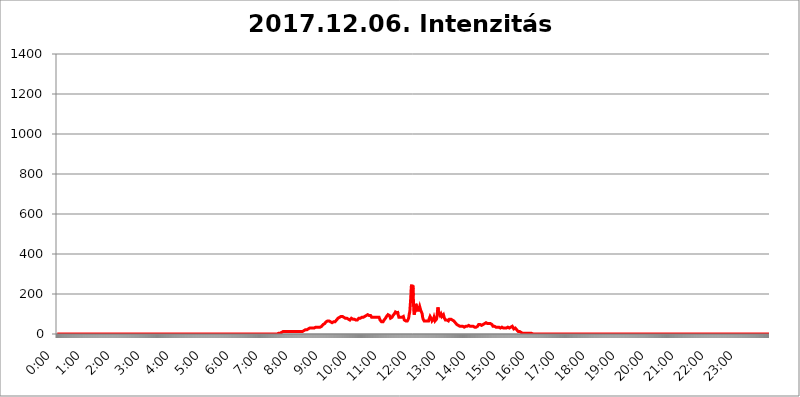
| Category | 2017.12.06. Intenzitás [W/m^2] |
|---|---|
| 0.0 | 0 |
| 0.0006944444444444445 | 0 |
| 0.001388888888888889 | 0 |
| 0.0020833333333333333 | 0 |
| 0.002777777777777778 | 0 |
| 0.003472222222222222 | 0 |
| 0.004166666666666667 | 0 |
| 0.004861111111111111 | 0 |
| 0.005555555555555556 | 0 |
| 0.0062499999999999995 | 0 |
| 0.006944444444444444 | 0 |
| 0.007638888888888889 | 0 |
| 0.008333333333333333 | 0 |
| 0.009027777777777779 | 0 |
| 0.009722222222222222 | 0 |
| 0.010416666666666666 | 0 |
| 0.011111111111111112 | 0 |
| 0.011805555555555555 | 0 |
| 0.012499999999999999 | 0 |
| 0.013194444444444444 | 0 |
| 0.013888888888888888 | 0 |
| 0.014583333333333332 | 0 |
| 0.015277777777777777 | 0 |
| 0.015972222222222224 | 0 |
| 0.016666666666666666 | 0 |
| 0.017361111111111112 | 0 |
| 0.018055555555555557 | 0 |
| 0.01875 | 0 |
| 0.019444444444444445 | 0 |
| 0.02013888888888889 | 0 |
| 0.020833333333333332 | 0 |
| 0.02152777777777778 | 0 |
| 0.022222222222222223 | 0 |
| 0.02291666666666667 | 0 |
| 0.02361111111111111 | 0 |
| 0.024305555555555556 | 0 |
| 0.024999999999999998 | 0 |
| 0.025694444444444447 | 0 |
| 0.02638888888888889 | 0 |
| 0.027083333333333334 | 0 |
| 0.027777777777777776 | 0 |
| 0.02847222222222222 | 0 |
| 0.029166666666666664 | 0 |
| 0.029861111111111113 | 0 |
| 0.030555555555555555 | 0 |
| 0.03125 | 0 |
| 0.03194444444444445 | 0 |
| 0.03263888888888889 | 0 |
| 0.03333333333333333 | 0 |
| 0.034027777777777775 | 0 |
| 0.034722222222222224 | 0 |
| 0.035416666666666666 | 0 |
| 0.036111111111111115 | 0 |
| 0.03680555555555556 | 0 |
| 0.0375 | 0 |
| 0.03819444444444444 | 0 |
| 0.03888888888888889 | 0 |
| 0.03958333333333333 | 0 |
| 0.04027777777777778 | 0 |
| 0.04097222222222222 | 0 |
| 0.041666666666666664 | 0 |
| 0.042361111111111106 | 0 |
| 0.04305555555555556 | 0 |
| 0.043750000000000004 | 0 |
| 0.044444444444444446 | 0 |
| 0.04513888888888889 | 0 |
| 0.04583333333333334 | 0 |
| 0.04652777777777778 | 0 |
| 0.04722222222222222 | 0 |
| 0.04791666666666666 | 0 |
| 0.04861111111111111 | 0 |
| 0.049305555555555554 | 0 |
| 0.049999999999999996 | 0 |
| 0.05069444444444445 | 0 |
| 0.051388888888888894 | 0 |
| 0.052083333333333336 | 0 |
| 0.05277777777777778 | 0 |
| 0.05347222222222222 | 0 |
| 0.05416666666666667 | 0 |
| 0.05486111111111111 | 0 |
| 0.05555555555555555 | 0 |
| 0.05625 | 0 |
| 0.05694444444444444 | 0 |
| 0.057638888888888885 | 0 |
| 0.05833333333333333 | 0 |
| 0.05902777777777778 | 0 |
| 0.059722222222222225 | 0 |
| 0.06041666666666667 | 0 |
| 0.061111111111111116 | 0 |
| 0.06180555555555556 | 0 |
| 0.0625 | 0 |
| 0.06319444444444444 | 0 |
| 0.06388888888888888 | 0 |
| 0.06458333333333334 | 0 |
| 0.06527777777777778 | 0 |
| 0.06597222222222222 | 0 |
| 0.06666666666666667 | 0 |
| 0.06736111111111111 | 0 |
| 0.06805555555555555 | 0 |
| 0.06874999999999999 | 0 |
| 0.06944444444444443 | 0 |
| 0.07013888888888889 | 0 |
| 0.07083333333333333 | 0 |
| 0.07152777777777779 | 0 |
| 0.07222222222222223 | 0 |
| 0.07291666666666667 | 0 |
| 0.07361111111111111 | 0 |
| 0.07430555555555556 | 0 |
| 0.075 | 0 |
| 0.07569444444444444 | 0 |
| 0.0763888888888889 | 0 |
| 0.07708333333333334 | 0 |
| 0.07777777777777778 | 0 |
| 0.07847222222222222 | 0 |
| 0.07916666666666666 | 0 |
| 0.0798611111111111 | 0 |
| 0.08055555555555556 | 0 |
| 0.08125 | 0 |
| 0.08194444444444444 | 0 |
| 0.08263888888888889 | 0 |
| 0.08333333333333333 | 0 |
| 0.08402777777777777 | 0 |
| 0.08472222222222221 | 0 |
| 0.08541666666666665 | 0 |
| 0.08611111111111112 | 0 |
| 0.08680555555555557 | 0 |
| 0.08750000000000001 | 0 |
| 0.08819444444444445 | 0 |
| 0.08888888888888889 | 0 |
| 0.08958333333333333 | 0 |
| 0.09027777777777778 | 0 |
| 0.09097222222222222 | 0 |
| 0.09166666666666667 | 0 |
| 0.09236111111111112 | 0 |
| 0.09305555555555556 | 0 |
| 0.09375 | 0 |
| 0.09444444444444444 | 0 |
| 0.09513888888888888 | 0 |
| 0.09583333333333333 | 0 |
| 0.09652777777777777 | 0 |
| 0.09722222222222222 | 0 |
| 0.09791666666666667 | 0 |
| 0.09861111111111111 | 0 |
| 0.09930555555555555 | 0 |
| 0.09999999999999999 | 0 |
| 0.10069444444444443 | 0 |
| 0.1013888888888889 | 0 |
| 0.10208333333333335 | 0 |
| 0.10277777777777779 | 0 |
| 0.10347222222222223 | 0 |
| 0.10416666666666667 | 0 |
| 0.10486111111111111 | 0 |
| 0.10555555555555556 | 0 |
| 0.10625 | 0 |
| 0.10694444444444444 | 0 |
| 0.1076388888888889 | 0 |
| 0.10833333333333334 | 0 |
| 0.10902777777777778 | 0 |
| 0.10972222222222222 | 0 |
| 0.1111111111111111 | 0 |
| 0.11180555555555556 | 0 |
| 0.11180555555555556 | 0 |
| 0.1125 | 0 |
| 0.11319444444444444 | 0 |
| 0.11388888888888889 | 0 |
| 0.11458333333333333 | 0 |
| 0.11527777777777777 | 0 |
| 0.11597222222222221 | 0 |
| 0.11666666666666665 | 0 |
| 0.1173611111111111 | 0 |
| 0.11805555555555557 | 0 |
| 0.11944444444444445 | 0 |
| 0.12013888888888889 | 0 |
| 0.12083333333333333 | 0 |
| 0.12152777777777778 | 0 |
| 0.12222222222222223 | 0 |
| 0.12291666666666667 | 0 |
| 0.12291666666666667 | 0 |
| 0.12361111111111112 | 0 |
| 0.12430555555555556 | 0 |
| 0.125 | 0 |
| 0.12569444444444444 | 0 |
| 0.12638888888888888 | 0 |
| 0.12708333333333333 | 0 |
| 0.16875 | 0 |
| 0.12847222222222224 | 0 |
| 0.12916666666666668 | 0 |
| 0.12986111111111112 | 0 |
| 0.13055555555555556 | 0 |
| 0.13125 | 0 |
| 0.13194444444444445 | 0 |
| 0.1326388888888889 | 0 |
| 0.13333333333333333 | 0 |
| 0.13402777777777777 | 0 |
| 0.13402777777777777 | 0 |
| 0.13472222222222222 | 0 |
| 0.13541666666666666 | 0 |
| 0.1361111111111111 | 0 |
| 0.13749999999999998 | 0 |
| 0.13819444444444443 | 0 |
| 0.1388888888888889 | 0 |
| 0.13958333333333334 | 0 |
| 0.14027777777777778 | 0 |
| 0.14097222222222222 | 0 |
| 0.14166666666666666 | 0 |
| 0.1423611111111111 | 0 |
| 0.14305555555555557 | 0 |
| 0.14375000000000002 | 0 |
| 0.14444444444444446 | 0 |
| 0.1451388888888889 | 0 |
| 0.1451388888888889 | 0 |
| 0.14652777777777778 | 0 |
| 0.14722222222222223 | 0 |
| 0.14791666666666667 | 0 |
| 0.1486111111111111 | 0 |
| 0.14930555555555555 | 0 |
| 0.15 | 0 |
| 0.15069444444444444 | 0 |
| 0.15138888888888888 | 0 |
| 0.15208333333333332 | 0 |
| 0.15277777777777776 | 0 |
| 0.15347222222222223 | 0 |
| 0.15416666666666667 | 0 |
| 0.15486111111111112 | 0 |
| 0.15555555555555556 | 0 |
| 0.15625 | 0 |
| 0.15694444444444444 | 0 |
| 0.15763888888888888 | 0 |
| 0.15833333333333333 | 0 |
| 0.15902777777777777 | 0 |
| 0.15972222222222224 | 0 |
| 0.16041666666666668 | 0 |
| 0.16111111111111112 | 0 |
| 0.16180555555555556 | 0 |
| 0.1625 | 0 |
| 0.16319444444444445 | 0 |
| 0.1638888888888889 | 0 |
| 0.16458333333333333 | 0 |
| 0.16527777777777777 | 0 |
| 0.16597222222222222 | 0 |
| 0.16666666666666666 | 0 |
| 0.1673611111111111 | 0 |
| 0.16805555555555554 | 0 |
| 0.16874999999999998 | 0 |
| 0.16944444444444443 | 0 |
| 0.17013888888888887 | 0 |
| 0.1708333333333333 | 0 |
| 0.17152777777777775 | 0 |
| 0.17222222222222225 | 0 |
| 0.1729166666666667 | 0 |
| 0.17361111111111113 | 0 |
| 0.17430555555555557 | 0 |
| 0.17500000000000002 | 0 |
| 0.17569444444444446 | 0 |
| 0.1763888888888889 | 0 |
| 0.17708333333333334 | 0 |
| 0.17777777777777778 | 0 |
| 0.17847222222222223 | 0 |
| 0.17916666666666667 | 0 |
| 0.1798611111111111 | 0 |
| 0.18055555555555555 | 0 |
| 0.18125 | 0 |
| 0.18194444444444444 | 0 |
| 0.1826388888888889 | 0 |
| 0.18333333333333335 | 0 |
| 0.1840277777777778 | 0 |
| 0.18472222222222223 | 0 |
| 0.18541666666666667 | 0 |
| 0.18611111111111112 | 0 |
| 0.18680555555555556 | 0 |
| 0.1875 | 0 |
| 0.18819444444444444 | 0 |
| 0.18888888888888888 | 0 |
| 0.18958333333333333 | 0 |
| 0.19027777777777777 | 0 |
| 0.1909722222222222 | 0 |
| 0.19166666666666665 | 0 |
| 0.19236111111111112 | 0 |
| 0.19305555555555554 | 0 |
| 0.19375 | 0 |
| 0.19444444444444445 | 0 |
| 0.1951388888888889 | 0 |
| 0.19583333333333333 | 0 |
| 0.19652777777777777 | 0 |
| 0.19722222222222222 | 0 |
| 0.19791666666666666 | 0 |
| 0.1986111111111111 | 0 |
| 0.19930555555555554 | 0 |
| 0.19999999999999998 | 0 |
| 0.20069444444444443 | 0 |
| 0.20138888888888887 | 0 |
| 0.2020833333333333 | 0 |
| 0.2027777777777778 | 0 |
| 0.2034722222222222 | 0 |
| 0.2041666666666667 | 0 |
| 0.20486111111111113 | 0 |
| 0.20555555555555557 | 0 |
| 0.20625000000000002 | 0 |
| 0.20694444444444446 | 0 |
| 0.2076388888888889 | 0 |
| 0.20833333333333334 | 0 |
| 0.20902777777777778 | 0 |
| 0.20972222222222223 | 0 |
| 0.21041666666666667 | 0 |
| 0.2111111111111111 | 0 |
| 0.21180555555555555 | 0 |
| 0.2125 | 0 |
| 0.21319444444444444 | 0 |
| 0.2138888888888889 | 0 |
| 0.21458333333333335 | 0 |
| 0.2152777777777778 | 0 |
| 0.21597222222222223 | 0 |
| 0.21666666666666667 | 0 |
| 0.21736111111111112 | 0 |
| 0.21805555555555556 | 0 |
| 0.21875 | 0 |
| 0.21944444444444444 | 0 |
| 0.22013888888888888 | 0 |
| 0.22083333333333333 | 0 |
| 0.22152777777777777 | 0 |
| 0.2222222222222222 | 0 |
| 0.22291666666666665 | 0 |
| 0.2236111111111111 | 0 |
| 0.22430555555555556 | 0 |
| 0.225 | 0 |
| 0.22569444444444445 | 0 |
| 0.2263888888888889 | 0 |
| 0.22708333333333333 | 0 |
| 0.22777777777777777 | 0 |
| 0.22847222222222222 | 0 |
| 0.22916666666666666 | 0 |
| 0.2298611111111111 | 0 |
| 0.23055555555555554 | 0 |
| 0.23124999999999998 | 0 |
| 0.23194444444444443 | 0 |
| 0.23263888888888887 | 0 |
| 0.2333333333333333 | 0 |
| 0.2340277777777778 | 0 |
| 0.2347222222222222 | 0 |
| 0.2354166666666667 | 0 |
| 0.23611111111111113 | 0 |
| 0.23680555555555557 | 0 |
| 0.23750000000000002 | 0 |
| 0.23819444444444446 | 0 |
| 0.2388888888888889 | 0 |
| 0.23958333333333334 | 0 |
| 0.24027777777777778 | 0 |
| 0.24097222222222223 | 0 |
| 0.24166666666666667 | 0 |
| 0.2423611111111111 | 0 |
| 0.24305555555555555 | 0 |
| 0.24375 | 0 |
| 0.24444444444444446 | 0 |
| 0.24513888888888888 | 0 |
| 0.24583333333333335 | 0 |
| 0.2465277777777778 | 0 |
| 0.24722222222222223 | 0 |
| 0.24791666666666667 | 0 |
| 0.24861111111111112 | 0 |
| 0.24930555555555556 | 0 |
| 0.25 | 0 |
| 0.25069444444444444 | 0 |
| 0.2513888888888889 | 0 |
| 0.2520833333333333 | 0 |
| 0.25277777777777777 | 0 |
| 0.2534722222222222 | 0 |
| 0.25416666666666665 | 0 |
| 0.2548611111111111 | 0 |
| 0.2555555555555556 | 0 |
| 0.25625000000000003 | 0 |
| 0.2569444444444445 | 0 |
| 0.2576388888888889 | 0 |
| 0.25833333333333336 | 0 |
| 0.2590277777777778 | 0 |
| 0.25972222222222224 | 0 |
| 0.2604166666666667 | 0 |
| 0.2611111111111111 | 0 |
| 0.26180555555555557 | 0 |
| 0.2625 | 0 |
| 0.26319444444444445 | 0 |
| 0.2638888888888889 | 0 |
| 0.26458333333333334 | 0 |
| 0.2652777777777778 | 0 |
| 0.2659722222222222 | 0 |
| 0.26666666666666666 | 0 |
| 0.2673611111111111 | 0 |
| 0.26805555555555555 | 0 |
| 0.26875 | 0 |
| 0.26944444444444443 | 0 |
| 0.2701388888888889 | 0 |
| 0.2708333333333333 | 0 |
| 0.27152777777777776 | 0 |
| 0.2722222222222222 | 0 |
| 0.27291666666666664 | 0 |
| 0.2736111111111111 | 0 |
| 0.2743055555555555 | 0 |
| 0.27499999999999997 | 0 |
| 0.27569444444444446 | 0 |
| 0.27638888888888885 | 0 |
| 0.27708333333333335 | 0 |
| 0.2777777777777778 | 0 |
| 0.27847222222222223 | 0 |
| 0.2791666666666667 | 0 |
| 0.2798611111111111 | 0 |
| 0.28055555555555556 | 0 |
| 0.28125 | 0 |
| 0.28194444444444444 | 0 |
| 0.2826388888888889 | 0 |
| 0.2833333333333333 | 0 |
| 0.28402777777777777 | 0 |
| 0.2847222222222222 | 0 |
| 0.28541666666666665 | 0 |
| 0.28611111111111115 | 0 |
| 0.28680555555555554 | 0 |
| 0.28750000000000003 | 0 |
| 0.2881944444444445 | 0 |
| 0.2888888888888889 | 0 |
| 0.28958333333333336 | 0 |
| 0.2902777777777778 | 0 |
| 0.29097222222222224 | 0 |
| 0.2916666666666667 | 0 |
| 0.2923611111111111 | 0 |
| 0.29305555555555557 | 0 |
| 0.29375 | 0 |
| 0.29444444444444445 | 0 |
| 0.2951388888888889 | 0 |
| 0.29583333333333334 | 0 |
| 0.2965277777777778 | 0 |
| 0.2972222222222222 | 0 |
| 0.29791666666666666 | 0 |
| 0.2986111111111111 | 0 |
| 0.29930555555555555 | 0 |
| 0.3 | 0 |
| 0.30069444444444443 | 0 |
| 0.3013888888888889 | 0 |
| 0.3020833333333333 | 0 |
| 0.30277777777777776 | 0 |
| 0.3034722222222222 | 0 |
| 0.30416666666666664 | 0 |
| 0.3048611111111111 | 0 |
| 0.3055555555555555 | 0 |
| 0.30624999999999997 | 0 |
| 0.3069444444444444 | 0 |
| 0.3076388888888889 | 0 |
| 0.30833333333333335 | 0 |
| 0.3090277777777778 | 3.525 |
| 0.30972222222222223 | 3.525 |
| 0.3104166666666667 | 3.525 |
| 0.3111111111111111 | 3.525 |
| 0.31180555555555556 | 3.525 |
| 0.3125 | 3.525 |
| 0.31319444444444444 | 3.525 |
| 0.3138888888888889 | 7.887 |
| 0.3145833333333333 | 7.887 |
| 0.31527777777777777 | 12.257 |
| 0.3159722222222222 | 12.257 |
| 0.31666666666666665 | 12.257 |
| 0.31736111111111115 | 12.257 |
| 0.31805555555555554 | 16.636 |
| 0.31875000000000003 | 12.257 |
| 0.3194444444444445 | 16.636 |
| 0.3201388888888889 | 12.257 |
| 0.32083333333333336 | 12.257 |
| 0.3215277777777778 | 12.257 |
| 0.32222222222222224 | 12.257 |
| 0.3229166666666667 | 12.257 |
| 0.3236111111111111 | 12.257 |
| 0.32430555555555557 | 12.257 |
| 0.325 | 12.257 |
| 0.32569444444444445 | 12.257 |
| 0.3263888888888889 | 12.257 |
| 0.32708333333333334 | 12.257 |
| 0.3277777777777778 | 12.257 |
| 0.3284722222222222 | 12.257 |
| 0.32916666666666666 | 12.257 |
| 0.3298611111111111 | 12.257 |
| 0.33055555555555555 | 12.257 |
| 0.33125 | 12.257 |
| 0.33194444444444443 | 12.257 |
| 0.3326388888888889 | 12.257 |
| 0.3333333333333333 | 12.257 |
| 0.3340277777777778 | 12.257 |
| 0.3347222222222222 | 12.257 |
| 0.3354166666666667 | 12.257 |
| 0.3361111111111111 | 12.257 |
| 0.3368055555555556 | 12.257 |
| 0.33749999999999997 | 12.257 |
| 0.33819444444444446 | 12.257 |
| 0.33888888888888885 | 12.257 |
| 0.33958333333333335 | 12.257 |
| 0.34027777777777773 | 12.257 |
| 0.34097222222222223 | 12.257 |
| 0.3416666666666666 | 12.257 |
| 0.3423611111111111 | 12.257 |
| 0.3430555555555555 | 12.257 |
| 0.34375 | 12.257 |
| 0.3444444444444445 | 16.636 |
| 0.3451388888888889 | 16.636 |
| 0.3458333333333334 | 16.636 |
| 0.34652777777777777 | 16.636 |
| 0.34722222222222227 | 21.024 |
| 0.34791666666666665 | 21.024 |
| 0.34861111111111115 | 21.024 |
| 0.34930555555555554 | 21.024 |
| 0.35000000000000003 | 21.024 |
| 0.3506944444444444 | 21.024 |
| 0.3513888888888889 | 21.024 |
| 0.3520833333333333 | 25.419 |
| 0.3527777777777778 | 25.419 |
| 0.3534722222222222 | 29.823 |
| 0.3541666666666667 | 29.823 |
| 0.3548611111111111 | 25.419 |
| 0.35555555555555557 | 25.419 |
| 0.35625 | 29.823 |
| 0.35694444444444445 | 29.823 |
| 0.3576388888888889 | 29.823 |
| 0.35833333333333334 | 29.823 |
| 0.3590277777777778 | 29.823 |
| 0.3597222222222222 | 29.823 |
| 0.36041666666666666 | 29.823 |
| 0.3611111111111111 | 29.823 |
| 0.36180555555555555 | 29.823 |
| 0.3625 | 34.234 |
| 0.36319444444444443 | 34.234 |
| 0.3638888888888889 | 34.234 |
| 0.3645833333333333 | 34.234 |
| 0.3652777777777778 | 34.234 |
| 0.3659722222222222 | 34.234 |
| 0.3666666666666667 | 34.234 |
| 0.3673611111111111 | 34.234 |
| 0.3680555555555556 | 34.234 |
| 0.36874999999999997 | 34.234 |
| 0.36944444444444446 | 34.234 |
| 0.37013888888888885 | 34.234 |
| 0.37083333333333335 | 38.653 |
| 0.37152777777777773 | 43.079 |
| 0.37222222222222223 | 43.079 |
| 0.3729166666666666 | 47.511 |
| 0.3736111111111111 | 51.951 |
| 0.3743055555555555 | 51.951 |
| 0.375 | 51.951 |
| 0.3756944444444445 | 56.398 |
| 0.3763888888888889 | 56.398 |
| 0.3770833333333334 | 60.85 |
| 0.37777777777777777 | 65.31 |
| 0.37847222222222227 | 65.31 |
| 0.37916666666666665 | 65.31 |
| 0.37986111111111115 | 65.31 |
| 0.38055555555555554 | 65.31 |
| 0.38125000000000003 | 65.31 |
| 0.3819444444444444 | 60.85 |
| 0.3826388888888889 | 60.85 |
| 0.3833333333333333 | 60.85 |
| 0.3840277777777778 | 56.398 |
| 0.3847222222222222 | 56.398 |
| 0.3854166666666667 | 56.398 |
| 0.3861111111111111 | 56.398 |
| 0.38680555555555557 | 56.398 |
| 0.3875 | 60.85 |
| 0.38819444444444445 | 60.85 |
| 0.3888888888888889 | 60.85 |
| 0.38958333333333334 | 60.85 |
| 0.3902777777777778 | 65.31 |
| 0.3909722222222222 | 65.31 |
| 0.39166666666666666 | 69.775 |
| 0.3923611111111111 | 69.775 |
| 0.39305555555555555 | 74.246 |
| 0.39375 | 78.722 |
| 0.39444444444444443 | 78.722 |
| 0.3951388888888889 | 83.205 |
| 0.3958333333333333 | 83.205 |
| 0.3965277777777778 | 83.205 |
| 0.3972222222222222 | 83.205 |
| 0.3979166666666667 | 87.692 |
| 0.3986111111111111 | 87.692 |
| 0.3993055555555556 | 87.692 |
| 0.39999999999999997 | 87.692 |
| 0.40069444444444446 | 83.205 |
| 0.40138888888888885 | 83.205 |
| 0.40208333333333335 | 83.205 |
| 0.40277777777777773 | 83.205 |
| 0.40347222222222223 | 78.722 |
| 0.4041666666666666 | 78.722 |
| 0.4048611111111111 | 78.722 |
| 0.4055555555555555 | 78.722 |
| 0.40625 | 78.722 |
| 0.4069444444444445 | 74.246 |
| 0.4076388888888889 | 74.246 |
| 0.4083333333333334 | 74.246 |
| 0.40902777777777777 | 69.775 |
| 0.40972222222222227 | 69.775 |
| 0.41041666666666665 | 69.775 |
| 0.41111111111111115 | 69.775 |
| 0.41180555555555554 | 74.246 |
| 0.41250000000000003 | 78.722 |
| 0.4131944444444444 | 78.722 |
| 0.4138888888888889 | 78.722 |
| 0.4145833333333333 | 74.246 |
| 0.4152777777777778 | 74.246 |
| 0.4159722222222222 | 74.246 |
| 0.4166666666666667 | 74.246 |
| 0.4173611111111111 | 74.246 |
| 0.41805555555555557 | 74.246 |
| 0.41875 | 69.775 |
| 0.41944444444444445 | 65.31 |
| 0.4201388888888889 | 65.31 |
| 0.42083333333333334 | 69.775 |
| 0.4215277777777778 | 69.775 |
| 0.4222222222222222 | 74.246 |
| 0.42291666666666666 | 78.722 |
| 0.4236111111111111 | 78.722 |
| 0.42430555555555555 | 78.722 |
| 0.425 | 78.722 |
| 0.42569444444444443 | 78.722 |
| 0.4263888888888889 | 78.722 |
| 0.4270833333333333 | 83.205 |
| 0.4277777777777778 | 83.205 |
| 0.4284722222222222 | 83.205 |
| 0.4291666666666667 | 83.205 |
| 0.4298611111111111 | 83.205 |
| 0.4305555555555556 | 83.205 |
| 0.43124999999999997 | 87.692 |
| 0.43194444444444446 | 87.692 |
| 0.43263888888888885 | 92.184 |
| 0.43333333333333335 | 92.184 |
| 0.43402777777777773 | 92.184 |
| 0.43472222222222223 | 92.184 |
| 0.4354166666666666 | 96.682 |
| 0.4361111111111111 | 92.184 |
| 0.4368055555555555 | 92.184 |
| 0.4375 | 92.184 |
| 0.4381944444444445 | 92.184 |
| 0.4388888888888889 | 92.184 |
| 0.4395833333333334 | 92.184 |
| 0.44027777777777777 | 87.692 |
| 0.44097222222222227 | 83.205 |
| 0.44166666666666665 | 83.205 |
| 0.44236111111111115 | 78.722 |
| 0.44305555555555554 | 83.205 |
| 0.44375000000000003 | 83.205 |
| 0.4444444444444444 | 83.205 |
| 0.4451388888888889 | 83.205 |
| 0.4458333333333333 | 83.205 |
| 0.4465277777777778 | 83.205 |
| 0.4472222222222222 | 83.205 |
| 0.4479166666666667 | 87.692 |
| 0.4486111111111111 | 83.205 |
| 0.44930555555555557 | 83.205 |
| 0.45 | 87.692 |
| 0.45069444444444445 | 83.205 |
| 0.4513888888888889 | 83.205 |
| 0.45208333333333334 | 78.722 |
| 0.4527777777777778 | 69.775 |
| 0.4534722222222222 | 65.31 |
| 0.45416666666666666 | 65.31 |
| 0.4548611111111111 | 60.85 |
| 0.45555555555555555 | 60.85 |
| 0.45625 | 60.85 |
| 0.45694444444444443 | 60.85 |
| 0.4576388888888889 | 65.31 |
| 0.4583333333333333 | 69.775 |
| 0.4590277777777778 | 69.775 |
| 0.4597222222222222 | 69.775 |
| 0.4604166666666667 | 78.722 |
| 0.4611111111111111 | 78.722 |
| 0.4618055555555556 | 87.692 |
| 0.46249999999999997 | 92.184 |
| 0.46319444444444446 | 92.184 |
| 0.46388888888888885 | 96.682 |
| 0.46458333333333335 | 101.184 |
| 0.46527777777777773 | 101.184 |
| 0.46597222222222223 | 92.184 |
| 0.4666666666666666 | 87.692 |
| 0.4673611111111111 | 78.722 |
| 0.4680555555555555 | 74.246 |
| 0.46875 | 74.246 |
| 0.4694444444444445 | 83.205 |
| 0.4701388888888889 | 87.692 |
| 0.4708333333333334 | 92.184 |
| 0.47152777777777777 | 92.184 |
| 0.47222222222222227 | 96.682 |
| 0.47291666666666665 | 101.184 |
| 0.47361111111111115 | 105.69 |
| 0.47430555555555554 | 110.201 |
| 0.47500000000000003 | 110.201 |
| 0.4756944444444444 | 105.69 |
| 0.4763888888888889 | 105.69 |
| 0.4770833333333333 | 114.716 |
| 0.4777777777777778 | 101.184 |
| 0.4784722222222222 | 92.184 |
| 0.4791666666666667 | 83.205 |
| 0.4798611111111111 | 78.722 |
| 0.48055555555555557 | 83.205 |
| 0.48125 | 83.205 |
| 0.48194444444444445 | 83.205 |
| 0.4826388888888889 | 83.205 |
| 0.48333333333333334 | 83.205 |
| 0.4840277777777778 | 83.205 |
| 0.4847222222222222 | 83.205 |
| 0.48541666666666666 | 87.692 |
| 0.4861111111111111 | 78.722 |
| 0.48680555555555555 | 69.775 |
| 0.4875 | 65.31 |
| 0.48819444444444443 | 65.31 |
| 0.4888888888888889 | 65.31 |
| 0.4895833333333333 | 65.31 |
| 0.4902777777777778 | 65.31 |
| 0.4909722222222222 | 65.31 |
| 0.4916666666666667 | 69.775 |
| 0.4923611111111111 | 74.246 |
| 0.4930555555555556 | 83.205 |
| 0.49374999999999997 | 101.184 |
| 0.49444444444444446 | 110.201 |
| 0.49513888888888885 | 146.423 |
| 0.49583333333333335 | 182.82 |
| 0.49652777777777773 | 237.564 |
| 0.49722222222222223 | 246.689 |
| 0.4979166666666666 | 178.264 |
| 0.4986111111111111 | 242.127 |
| 0.4993055555555555 | 191.937 |
| 0.5 | 119.235 |
| 0.5006944444444444 | 96.682 |
| 0.5013888888888889 | 101.184 |
| 0.5020833333333333 | 123.758 |
| 0.5027777777777778 | 150.964 |
| 0.5034722222222222 | 146.423 |
| 0.5041666666666667 | 137.347 |
| 0.5048611111111111 | 119.235 |
| 0.5055555555555555 | 114.716 |
| 0.50625 | 114.716 |
| 0.5069444444444444 | 119.235 |
| 0.5076388888888889 | 128.284 |
| 0.5083333333333333 | 137.347 |
| 0.5090277777777777 | 137.347 |
| 0.5097222222222222 | 119.235 |
| 0.5104166666666666 | 119.235 |
| 0.5111111111111112 | 119.235 |
| 0.5118055555555555 | 101.184 |
| 0.5125000000000001 | 83.205 |
| 0.5131944444444444 | 74.246 |
| 0.513888888888889 | 69.775 |
| 0.5145833333333333 | 65.31 |
| 0.5152777777777778 | 65.31 |
| 0.5159722222222222 | 69.775 |
| 0.5166666666666667 | 65.31 |
| 0.517361111111111 | 65.31 |
| 0.5180555555555556 | 65.31 |
| 0.5187499999999999 | 65.31 |
| 0.5194444444444445 | 65.31 |
| 0.5201388888888888 | 65.31 |
| 0.5208333333333334 | 65.31 |
| 0.5215277777777778 | 74.246 |
| 0.5222222222222223 | 78.722 |
| 0.5229166666666667 | 87.692 |
| 0.5236111111111111 | 92.184 |
| 0.5243055555555556 | 87.692 |
| 0.525 | 74.246 |
| 0.5256944444444445 | 65.31 |
| 0.5263888888888889 | 65.31 |
| 0.5270833333333333 | 65.31 |
| 0.5277777777777778 | 74.246 |
| 0.5284722222222222 | 83.205 |
| 0.5291666666666667 | 78.722 |
| 0.5298611111111111 | 65.31 |
| 0.5305555555555556 | 65.31 |
| 0.53125 | 69.775 |
| 0.5319444444444444 | 74.246 |
| 0.5326388888888889 | 87.692 |
| 0.5333333333333333 | 114.716 |
| 0.5340277777777778 | 132.814 |
| 0.5347222222222222 | 110.201 |
| 0.5354166666666667 | 101.184 |
| 0.5361111111111111 | 96.682 |
| 0.5368055555555555 | 92.184 |
| 0.5375 | 92.184 |
| 0.5381944444444444 | 101.184 |
| 0.5388888888888889 | 101.184 |
| 0.5395833333333333 | 87.692 |
| 0.5402777777777777 | 83.205 |
| 0.5409722222222222 | 83.205 |
| 0.5416666666666666 | 96.682 |
| 0.5423611111111112 | 92.184 |
| 0.5430555555555555 | 78.722 |
| 0.5437500000000001 | 78.722 |
| 0.5444444444444444 | 69.775 |
| 0.545138888888889 | 69.775 |
| 0.5458333333333333 | 69.775 |
| 0.5465277777777778 | 69.775 |
| 0.5472222222222222 | 65.31 |
| 0.5479166666666667 | 65.31 |
| 0.548611111111111 | 65.31 |
| 0.5493055555555556 | 69.775 |
| 0.5499999999999999 | 74.246 |
| 0.5506944444444445 | 74.246 |
| 0.5513888888888888 | 69.775 |
| 0.5520833333333334 | 74.246 |
| 0.5527777777777778 | 78.722 |
| 0.5534722222222223 | 74.246 |
| 0.5541666666666667 | 69.775 |
| 0.5548611111111111 | 65.31 |
| 0.5555555555555556 | 65.31 |
| 0.55625 | 65.31 |
| 0.5569444444444445 | 60.85 |
| 0.5576388888888889 | 60.85 |
| 0.5583333333333333 | 56.398 |
| 0.5590277777777778 | 56.398 |
| 0.5597222222222222 | 51.951 |
| 0.5604166666666667 | 47.511 |
| 0.5611111111111111 | 47.511 |
| 0.5618055555555556 | 43.079 |
| 0.5625 | 43.079 |
| 0.5631944444444444 | 38.653 |
| 0.5638888888888889 | 38.653 |
| 0.5645833333333333 | 38.653 |
| 0.5652777777777778 | 38.653 |
| 0.5659722222222222 | 43.079 |
| 0.5666666666666667 | 38.653 |
| 0.5673611111111111 | 38.653 |
| 0.5680555555555555 | 38.653 |
| 0.56875 | 38.653 |
| 0.5694444444444444 | 34.234 |
| 0.5701388888888889 | 34.234 |
| 0.5708333333333333 | 34.234 |
| 0.5715277777777777 | 34.234 |
| 0.5722222222222222 | 34.234 |
| 0.5729166666666666 | 38.653 |
| 0.5736111111111112 | 38.653 |
| 0.5743055555555555 | 38.653 |
| 0.5750000000000001 | 38.653 |
| 0.5756944444444444 | 38.653 |
| 0.576388888888889 | 43.079 |
| 0.5770833333333333 | 43.079 |
| 0.5777777777777778 | 43.079 |
| 0.5784722222222222 | 43.079 |
| 0.5791666666666667 | 38.653 |
| 0.579861111111111 | 38.653 |
| 0.5805555555555556 | 38.653 |
| 0.5812499999999999 | 38.653 |
| 0.5819444444444445 | 38.653 |
| 0.5826388888888888 | 38.653 |
| 0.5833333333333334 | 38.653 |
| 0.5840277777777778 | 34.234 |
| 0.5847222222222223 | 34.234 |
| 0.5854166666666667 | 34.234 |
| 0.5861111111111111 | 34.234 |
| 0.5868055555555556 | 34.234 |
| 0.5875 | 34.234 |
| 0.5881944444444445 | 38.653 |
| 0.5888888888888889 | 38.653 |
| 0.5895833333333333 | 38.653 |
| 0.5902777777777778 | 43.079 |
| 0.5909722222222222 | 47.511 |
| 0.5916666666666667 | 47.511 |
| 0.5923611111111111 | 47.511 |
| 0.5930555555555556 | 47.511 |
| 0.59375 | 43.079 |
| 0.5944444444444444 | 47.511 |
| 0.5951388888888889 | 43.079 |
| 0.5958333333333333 | 47.511 |
| 0.5965277777777778 | 43.079 |
| 0.5972222222222222 | 47.511 |
| 0.5979166666666667 | 47.511 |
| 0.5986111111111111 | 51.951 |
| 0.5993055555555555 | 51.951 |
| 0.6 | 56.398 |
| 0.6006944444444444 | 56.398 |
| 0.6013888888888889 | 56.398 |
| 0.6020833333333333 | 51.951 |
| 0.6027777777777777 | 56.398 |
| 0.6034722222222222 | 51.951 |
| 0.6041666666666666 | 51.951 |
| 0.6048611111111112 | 51.951 |
| 0.6055555555555555 | 51.951 |
| 0.6062500000000001 | 51.951 |
| 0.6069444444444444 | 51.951 |
| 0.607638888888889 | 51.951 |
| 0.6083333333333333 | 51.951 |
| 0.6090277777777778 | 51.951 |
| 0.6097222222222222 | 47.511 |
| 0.6104166666666667 | 43.079 |
| 0.611111111111111 | 38.653 |
| 0.6118055555555556 | 43.079 |
| 0.6124999999999999 | 43.079 |
| 0.6131944444444445 | 38.653 |
| 0.6138888888888888 | 38.653 |
| 0.6145833333333334 | 38.653 |
| 0.6152777777777778 | 34.234 |
| 0.6159722222222223 | 34.234 |
| 0.6166666666666667 | 34.234 |
| 0.6173611111111111 | 34.234 |
| 0.6180555555555556 | 29.823 |
| 0.61875 | 29.823 |
| 0.6194444444444445 | 34.234 |
| 0.6201388888888889 | 29.823 |
| 0.6208333333333333 | 34.234 |
| 0.6215277777777778 | 29.823 |
| 0.6222222222222222 | 29.823 |
| 0.6229166666666667 | 34.234 |
| 0.6236111111111111 | 34.234 |
| 0.6243055555555556 | 34.234 |
| 0.625 | 29.823 |
| 0.6256944444444444 | 29.823 |
| 0.6263888888888889 | 29.823 |
| 0.6270833333333333 | 29.823 |
| 0.6277777777777778 | 29.823 |
| 0.6284722222222222 | 29.823 |
| 0.6291666666666667 | 29.823 |
| 0.6298611111111111 | 29.823 |
| 0.6305555555555555 | 29.823 |
| 0.63125 | 34.234 |
| 0.6319444444444444 | 34.234 |
| 0.6326388888888889 | 38.653 |
| 0.6333333333333333 | 34.234 |
| 0.6340277777777777 | 29.823 |
| 0.6347222222222222 | 29.823 |
| 0.6354166666666666 | 29.823 |
| 0.6361111111111112 | 34.234 |
| 0.6368055555555555 | 38.653 |
| 0.6375000000000001 | 38.653 |
| 0.6381944444444444 | 38.653 |
| 0.638888888888889 | 34.234 |
| 0.6395833333333333 | 34.234 |
| 0.6402777777777778 | 25.419 |
| 0.6409722222222222 | 25.419 |
| 0.6416666666666667 | 25.419 |
| 0.642361111111111 | 29.823 |
| 0.6430555555555556 | 25.419 |
| 0.6437499999999999 | 25.419 |
| 0.6444444444444445 | 21.024 |
| 0.6451388888888888 | 21.024 |
| 0.6458333333333334 | 16.636 |
| 0.6465277777777778 | 12.257 |
| 0.6472222222222223 | 12.257 |
| 0.6479166666666667 | 12.257 |
| 0.6486111111111111 | 12.257 |
| 0.6493055555555556 | 12.257 |
| 0.65 | 7.887 |
| 0.6506944444444445 | 7.887 |
| 0.6513888888888889 | 7.887 |
| 0.6520833333333333 | 7.887 |
| 0.6527777777777778 | 3.525 |
| 0.6534722222222222 | 3.525 |
| 0.6541666666666667 | 3.525 |
| 0.6548611111111111 | 3.525 |
| 0.6555555555555556 | 3.525 |
| 0.65625 | 3.525 |
| 0.6569444444444444 | 3.525 |
| 0.6576388888888889 | 3.525 |
| 0.6583333333333333 | 3.525 |
| 0.6590277777777778 | 3.525 |
| 0.6597222222222222 | 3.525 |
| 0.6604166666666667 | 3.525 |
| 0.6611111111111111 | 3.525 |
| 0.6618055555555555 | 3.525 |
| 0.6625 | 3.525 |
| 0.6631944444444444 | 3.525 |
| 0.6638888888888889 | 3.525 |
| 0.6645833333333333 | 3.525 |
| 0.6652777777777777 | 3.525 |
| 0.6659722222222222 | 3.525 |
| 0.6666666666666666 | 3.525 |
| 0.6673611111111111 | 0 |
| 0.6680555555555556 | 0 |
| 0.6687500000000001 | 0 |
| 0.6694444444444444 | 0 |
| 0.6701388888888888 | 0 |
| 0.6708333333333334 | 0 |
| 0.6715277777777778 | 0 |
| 0.6722222222222222 | 0 |
| 0.6729166666666666 | 0 |
| 0.6736111111111112 | 0 |
| 0.6743055555555556 | 0 |
| 0.6749999999999999 | 0 |
| 0.6756944444444444 | 0 |
| 0.6763888888888889 | 0 |
| 0.6770833333333334 | 0 |
| 0.6777777777777777 | 0 |
| 0.6784722222222223 | 0 |
| 0.6791666666666667 | 0 |
| 0.6798611111111111 | 0 |
| 0.6805555555555555 | 0 |
| 0.68125 | 0 |
| 0.6819444444444445 | 0 |
| 0.6826388888888889 | 0 |
| 0.6833333333333332 | 0 |
| 0.6840277777777778 | 0 |
| 0.6847222222222222 | 0 |
| 0.6854166666666667 | 0 |
| 0.686111111111111 | 0 |
| 0.6868055555555556 | 0 |
| 0.6875 | 0 |
| 0.6881944444444444 | 0 |
| 0.688888888888889 | 0 |
| 0.6895833333333333 | 0 |
| 0.6902777777777778 | 0 |
| 0.6909722222222222 | 0 |
| 0.6916666666666668 | 0 |
| 0.6923611111111111 | 0 |
| 0.6930555555555555 | 0 |
| 0.69375 | 0 |
| 0.6944444444444445 | 0 |
| 0.6951388888888889 | 0 |
| 0.6958333333333333 | 0 |
| 0.6965277777777777 | 0 |
| 0.6972222222222223 | 0 |
| 0.6979166666666666 | 0 |
| 0.6986111111111111 | 0 |
| 0.6993055555555556 | 0 |
| 0.7000000000000001 | 0 |
| 0.7006944444444444 | 0 |
| 0.7013888888888888 | 0 |
| 0.7020833333333334 | 0 |
| 0.7027777777777778 | 0 |
| 0.7034722222222222 | 0 |
| 0.7041666666666666 | 0 |
| 0.7048611111111112 | 0 |
| 0.7055555555555556 | 0 |
| 0.7062499999999999 | 0 |
| 0.7069444444444444 | 0 |
| 0.7076388888888889 | 0 |
| 0.7083333333333334 | 0 |
| 0.7090277777777777 | 0 |
| 0.7097222222222223 | 0 |
| 0.7104166666666667 | 0 |
| 0.7111111111111111 | 0 |
| 0.7118055555555555 | 0 |
| 0.7125 | 0 |
| 0.7131944444444445 | 0 |
| 0.7138888888888889 | 0 |
| 0.7145833333333332 | 0 |
| 0.7152777777777778 | 0 |
| 0.7159722222222222 | 0 |
| 0.7166666666666667 | 0 |
| 0.717361111111111 | 0 |
| 0.7180555555555556 | 0 |
| 0.71875 | 0 |
| 0.7194444444444444 | 0 |
| 0.720138888888889 | 0 |
| 0.7208333333333333 | 0 |
| 0.7215277777777778 | 0 |
| 0.7222222222222222 | 0 |
| 0.7229166666666668 | 0 |
| 0.7236111111111111 | 0 |
| 0.7243055555555555 | 0 |
| 0.725 | 0 |
| 0.7256944444444445 | 0 |
| 0.7263888888888889 | 0 |
| 0.7270833333333333 | 0 |
| 0.7277777777777777 | 0 |
| 0.7284722222222223 | 0 |
| 0.7291666666666666 | 0 |
| 0.7298611111111111 | 0 |
| 0.7305555555555556 | 0 |
| 0.7312500000000001 | 0 |
| 0.7319444444444444 | 0 |
| 0.7326388888888888 | 0 |
| 0.7333333333333334 | 0 |
| 0.7340277777777778 | 0 |
| 0.7347222222222222 | 0 |
| 0.7354166666666666 | 0 |
| 0.7361111111111112 | 0 |
| 0.7368055555555556 | 0 |
| 0.7374999999999999 | 0 |
| 0.7381944444444444 | 0 |
| 0.7388888888888889 | 0 |
| 0.7395833333333334 | 0 |
| 0.7402777777777777 | 0 |
| 0.7409722222222223 | 0 |
| 0.7416666666666667 | 0 |
| 0.7423611111111111 | 0 |
| 0.7430555555555555 | 0 |
| 0.74375 | 0 |
| 0.7444444444444445 | 0 |
| 0.7451388888888889 | 0 |
| 0.7458333333333332 | 0 |
| 0.7465277777777778 | 0 |
| 0.7472222222222222 | 0 |
| 0.7479166666666667 | 0 |
| 0.748611111111111 | 0 |
| 0.7493055555555556 | 0 |
| 0.75 | 0 |
| 0.7506944444444444 | 0 |
| 0.751388888888889 | 0 |
| 0.7520833333333333 | 0 |
| 0.7527777777777778 | 0 |
| 0.7534722222222222 | 0 |
| 0.7541666666666668 | 0 |
| 0.7548611111111111 | 0 |
| 0.7555555555555555 | 0 |
| 0.75625 | 0 |
| 0.7569444444444445 | 0 |
| 0.7576388888888889 | 0 |
| 0.7583333333333333 | 0 |
| 0.7590277777777777 | 0 |
| 0.7597222222222223 | 0 |
| 0.7604166666666666 | 0 |
| 0.7611111111111111 | 0 |
| 0.7618055555555556 | 0 |
| 0.7625000000000001 | 0 |
| 0.7631944444444444 | 0 |
| 0.7638888888888888 | 0 |
| 0.7645833333333334 | 0 |
| 0.7652777777777778 | 0 |
| 0.7659722222222222 | 0 |
| 0.7666666666666666 | 0 |
| 0.7673611111111112 | 0 |
| 0.7680555555555556 | 0 |
| 0.7687499999999999 | 0 |
| 0.7694444444444444 | 0 |
| 0.7701388888888889 | 0 |
| 0.7708333333333334 | 0 |
| 0.7715277777777777 | 0 |
| 0.7722222222222223 | 0 |
| 0.7729166666666667 | 0 |
| 0.7736111111111111 | 0 |
| 0.7743055555555555 | 0 |
| 0.775 | 0 |
| 0.7756944444444445 | 0 |
| 0.7763888888888889 | 0 |
| 0.7770833333333332 | 0 |
| 0.7777777777777778 | 0 |
| 0.7784722222222222 | 0 |
| 0.7791666666666667 | 0 |
| 0.779861111111111 | 0 |
| 0.7805555555555556 | 0 |
| 0.78125 | 0 |
| 0.7819444444444444 | 0 |
| 0.782638888888889 | 0 |
| 0.7833333333333333 | 0 |
| 0.7840277777777778 | 0 |
| 0.7847222222222222 | 0 |
| 0.7854166666666668 | 0 |
| 0.7861111111111111 | 0 |
| 0.7868055555555555 | 0 |
| 0.7875 | 0 |
| 0.7881944444444445 | 0 |
| 0.7888888888888889 | 0 |
| 0.7895833333333333 | 0 |
| 0.7902777777777777 | 0 |
| 0.7909722222222223 | 0 |
| 0.7916666666666666 | 0 |
| 0.7923611111111111 | 0 |
| 0.7930555555555556 | 0 |
| 0.7937500000000001 | 0 |
| 0.7944444444444444 | 0 |
| 0.7951388888888888 | 0 |
| 0.7958333333333334 | 0 |
| 0.7965277777777778 | 0 |
| 0.7972222222222222 | 0 |
| 0.7979166666666666 | 0 |
| 0.7986111111111112 | 0 |
| 0.7993055555555556 | 0 |
| 0.7999999999999999 | 0 |
| 0.8006944444444444 | 0 |
| 0.8013888888888889 | 0 |
| 0.8020833333333334 | 0 |
| 0.8027777777777777 | 0 |
| 0.8034722222222223 | 0 |
| 0.8041666666666667 | 0 |
| 0.8048611111111111 | 0 |
| 0.8055555555555555 | 0 |
| 0.80625 | 0 |
| 0.8069444444444445 | 0 |
| 0.8076388888888889 | 0 |
| 0.8083333333333332 | 0 |
| 0.8090277777777778 | 0 |
| 0.8097222222222222 | 0 |
| 0.8104166666666667 | 0 |
| 0.811111111111111 | 0 |
| 0.8118055555555556 | 0 |
| 0.8125 | 0 |
| 0.8131944444444444 | 0 |
| 0.813888888888889 | 0 |
| 0.8145833333333333 | 0 |
| 0.8152777777777778 | 0 |
| 0.8159722222222222 | 0 |
| 0.8166666666666668 | 0 |
| 0.8173611111111111 | 0 |
| 0.8180555555555555 | 0 |
| 0.81875 | 0 |
| 0.8194444444444445 | 0 |
| 0.8201388888888889 | 0 |
| 0.8208333333333333 | 0 |
| 0.8215277777777777 | 0 |
| 0.8222222222222223 | 0 |
| 0.8229166666666666 | 0 |
| 0.8236111111111111 | 0 |
| 0.8243055555555556 | 0 |
| 0.8250000000000001 | 0 |
| 0.8256944444444444 | 0 |
| 0.8263888888888888 | 0 |
| 0.8270833333333334 | 0 |
| 0.8277777777777778 | 0 |
| 0.8284722222222222 | 0 |
| 0.8291666666666666 | 0 |
| 0.8298611111111112 | 0 |
| 0.8305555555555556 | 0 |
| 0.8312499999999999 | 0 |
| 0.8319444444444444 | 0 |
| 0.8326388888888889 | 0 |
| 0.8333333333333334 | 0 |
| 0.8340277777777777 | 0 |
| 0.8347222222222223 | 0 |
| 0.8354166666666667 | 0 |
| 0.8361111111111111 | 0 |
| 0.8368055555555555 | 0 |
| 0.8375 | 0 |
| 0.8381944444444445 | 0 |
| 0.8388888888888889 | 0 |
| 0.8395833333333332 | 0 |
| 0.8402777777777778 | 0 |
| 0.8409722222222222 | 0 |
| 0.8416666666666667 | 0 |
| 0.842361111111111 | 0 |
| 0.8430555555555556 | 0 |
| 0.84375 | 0 |
| 0.8444444444444444 | 0 |
| 0.845138888888889 | 0 |
| 0.8458333333333333 | 0 |
| 0.8465277777777778 | 0 |
| 0.8472222222222222 | 0 |
| 0.8479166666666668 | 0 |
| 0.8486111111111111 | 0 |
| 0.8493055555555555 | 0 |
| 0.85 | 0 |
| 0.8506944444444445 | 0 |
| 0.8513888888888889 | 0 |
| 0.8520833333333333 | 0 |
| 0.8527777777777777 | 0 |
| 0.8534722222222223 | 0 |
| 0.8541666666666666 | 0 |
| 0.8548611111111111 | 0 |
| 0.8555555555555556 | 0 |
| 0.8562500000000001 | 0 |
| 0.8569444444444444 | 0 |
| 0.8576388888888888 | 0 |
| 0.8583333333333334 | 0 |
| 0.8590277777777778 | 0 |
| 0.8597222222222222 | 0 |
| 0.8604166666666666 | 0 |
| 0.8611111111111112 | 0 |
| 0.8618055555555556 | 0 |
| 0.8624999999999999 | 0 |
| 0.8631944444444444 | 0 |
| 0.8638888888888889 | 0 |
| 0.8645833333333334 | 0 |
| 0.8652777777777777 | 0 |
| 0.8659722222222223 | 0 |
| 0.8666666666666667 | 0 |
| 0.8673611111111111 | 0 |
| 0.8680555555555555 | 0 |
| 0.86875 | 0 |
| 0.8694444444444445 | 0 |
| 0.8701388888888889 | 0 |
| 0.8708333333333332 | 0 |
| 0.8715277777777778 | 0 |
| 0.8722222222222222 | 0 |
| 0.8729166666666667 | 0 |
| 0.873611111111111 | 0 |
| 0.8743055555555556 | 0 |
| 0.875 | 0 |
| 0.8756944444444444 | 0 |
| 0.876388888888889 | 0 |
| 0.8770833333333333 | 0 |
| 0.8777777777777778 | 0 |
| 0.8784722222222222 | 0 |
| 0.8791666666666668 | 0 |
| 0.8798611111111111 | 0 |
| 0.8805555555555555 | 0 |
| 0.88125 | 0 |
| 0.8819444444444445 | 0 |
| 0.8826388888888889 | 0 |
| 0.8833333333333333 | 0 |
| 0.8840277777777777 | 0 |
| 0.8847222222222223 | 0 |
| 0.8854166666666666 | 0 |
| 0.8861111111111111 | 0 |
| 0.8868055555555556 | 0 |
| 0.8875000000000001 | 0 |
| 0.8881944444444444 | 0 |
| 0.8888888888888888 | 0 |
| 0.8895833333333334 | 0 |
| 0.8902777777777778 | 0 |
| 0.8909722222222222 | 0 |
| 0.8916666666666666 | 0 |
| 0.8923611111111112 | 0 |
| 0.8930555555555556 | 0 |
| 0.8937499999999999 | 0 |
| 0.8944444444444444 | 0 |
| 0.8951388888888889 | 0 |
| 0.8958333333333334 | 0 |
| 0.8965277777777777 | 0 |
| 0.8972222222222223 | 0 |
| 0.8979166666666667 | 0 |
| 0.8986111111111111 | 0 |
| 0.8993055555555555 | 0 |
| 0.9 | 0 |
| 0.9006944444444445 | 0 |
| 0.9013888888888889 | 0 |
| 0.9020833333333332 | 0 |
| 0.9027777777777778 | 0 |
| 0.9034722222222222 | 0 |
| 0.9041666666666667 | 0 |
| 0.904861111111111 | 0 |
| 0.9055555555555556 | 0 |
| 0.90625 | 0 |
| 0.9069444444444444 | 0 |
| 0.907638888888889 | 0 |
| 0.9083333333333333 | 0 |
| 0.9090277777777778 | 0 |
| 0.9097222222222222 | 0 |
| 0.9104166666666668 | 0 |
| 0.9111111111111111 | 0 |
| 0.9118055555555555 | 0 |
| 0.9125 | 0 |
| 0.9131944444444445 | 0 |
| 0.9138888888888889 | 0 |
| 0.9145833333333333 | 0 |
| 0.9152777777777777 | 0 |
| 0.9159722222222223 | 0 |
| 0.9166666666666666 | 0 |
| 0.9173611111111111 | 0 |
| 0.9180555555555556 | 0 |
| 0.9187500000000001 | 0 |
| 0.9194444444444444 | 0 |
| 0.9201388888888888 | 0 |
| 0.9208333333333334 | 0 |
| 0.9215277777777778 | 0 |
| 0.9222222222222222 | 0 |
| 0.9229166666666666 | 0 |
| 0.9236111111111112 | 0 |
| 0.9243055555555556 | 0 |
| 0.9249999999999999 | 0 |
| 0.9256944444444444 | 0 |
| 0.9263888888888889 | 0 |
| 0.9270833333333334 | 0 |
| 0.9277777777777777 | 0 |
| 0.9284722222222223 | 0 |
| 0.9291666666666667 | 0 |
| 0.9298611111111111 | 0 |
| 0.9305555555555555 | 0 |
| 0.93125 | 0 |
| 0.9319444444444445 | 0 |
| 0.9326388888888889 | 0 |
| 0.9333333333333332 | 0 |
| 0.9340277777777778 | 0 |
| 0.9347222222222222 | 0 |
| 0.9354166666666667 | 0 |
| 0.936111111111111 | 0 |
| 0.9368055555555556 | 0 |
| 0.9375 | 0 |
| 0.9381944444444444 | 0 |
| 0.938888888888889 | 0 |
| 0.9395833333333333 | 0 |
| 0.9402777777777778 | 0 |
| 0.9409722222222222 | 0 |
| 0.9416666666666668 | 0 |
| 0.9423611111111111 | 0 |
| 0.9430555555555555 | 0 |
| 0.94375 | 0 |
| 0.9444444444444445 | 0 |
| 0.9451388888888889 | 0 |
| 0.9458333333333333 | 0 |
| 0.9465277777777777 | 0 |
| 0.9472222222222223 | 0 |
| 0.9479166666666666 | 0 |
| 0.9486111111111111 | 0 |
| 0.9493055555555556 | 0 |
| 0.9500000000000001 | 0 |
| 0.9506944444444444 | 0 |
| 0.9513888888888888 | 0 |
| 0.9520833333333334 | 0 |
| 0.9527777777777778 | 0 |
| 0.9534722222222222 | 0 |
| 0.9541666666666666 | 0 |
| 0.9548611111111112 | 0 |
| 0.9555555555555556 | 0 |
| 0.9562499999999999 | 0 |
| 0.9569444444444444 | 0 |
| 0.9576388888888889 | 0 |
| 0.9583333333333334 | 0 |
| 0.9590277777777777 | 0 |
| 0.9597222222222223 | 0 |
| 0.9604166666666667 | 0 |
| 0.9611111111111111 | 0 |
| 0.9618055555555555 | 0 |
| 0.9625 | 0 |
| 0.9631944444444445 | 0 |
| 0.9638888888888889 | 0 |
| 0.9645833333333332 | 0 |
| 0.9652777777777778 | 0 |
| 0.9659722222222222 | 0 |
| 0.9666666666666667 | 0 |
| 0.967361111111111 | 0 |
| 0.9680555555555556 | 0 |
| 0.96875 | 0 |
| 0.9694444444444444 | 0 |
| 0.970138888888889 | 0 |
| 0.9708333333333333 | 0 |
| 0.9715277777777778 | 0 |
| 0.9722222222222222 | 0 |
| 0.9729166666666668 | 0 |
| 0.9736111111111111 | 0 |
| 0.9743055555555555 | 0 |
| 0.975 | 0 |
| 0.9756944444444445 | 0 |
| 0.9763888888888889 | 0 |
| 0.9770833333333333 | 0 |
| 0.9777777777777777 | 0 |
| 0.9784722222222223 | 0 |
| 0.9791666666666666 | 0 |
| 0.9798611111111111 | 0 |
| 0.9805555555555556 | 0 |
| 0.9812500000000001 | 0 |
| 0.9819444444444444 | 0 |
| 0.9826388888888888 | 0 |
| 0.9833333333333334 | 0 |
| 0.9840277777777778 | 0 |
| 0.9847222222222222 | 0 |
| 0.9854166666666666 | 0 |
| 0.9861111111111112 | 0 |
| 0.9868055555555556 | 0 |
| 0.9874999999999999 | 0 |
| 0.9881944444444444 | 0 |
| 0.9888888888888889 | 0 |
| 0.9895833333333334 | 0 |
| 0.9902777777777777 | 0 |
| 0.9909722222222223 | 0 |
| 0.9916666666666667 | 0 |
| 0.9923611111111111 | 0 |
| 0.9930555555555555 | 0 |
| 0.99375 | 0 |
| 0.9944444444444445 | 0 |
| 0.9951388888888889 | 0 |
| 0.9958333333333332 | 0 |
| 0.9965277777777778 | 0 |
| 0.9972222222222222 | 0 |
| 0.9979166666666667 | 0 |
| 0.998611111111111 | 0 |
| 0.9993055555555556 | 0 |